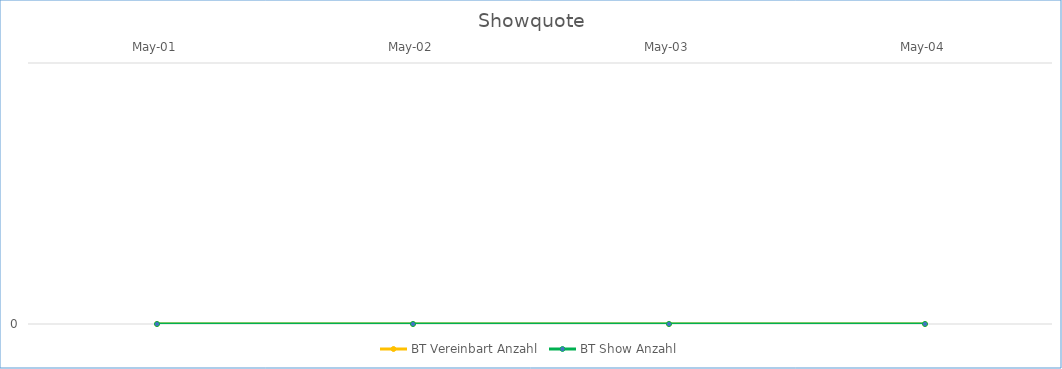
| Category | BT Vereinbart Anzahl | BT Show Anzahl |
|---|---|---|
| 2001-05-01 | 0 | 0 |
| 2002-05-01 | 0 | 0 |
| 2003-05-01 | 0 | 0 |
| 2004-05-01 | 0 | 0 |